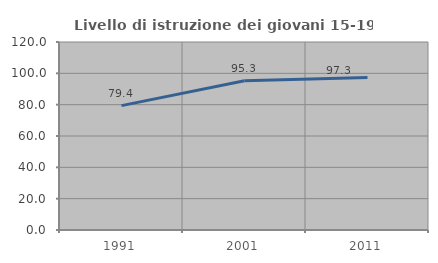
| Category | Livello di istruzione dei giovani 15-19 anni |
|---|---|
| 1991.0 | 79.402 |
| 2001.0 | 95.293 |
| 2011.0 | 97.333 |